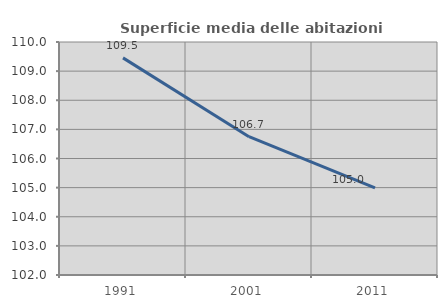
| Category | Superficie media delle abitazioni occupate |
|---|---|
| 1991.0 | 109.456 |
| 2001.0 | 106.748 |
| 2011.0 | 104.994 |